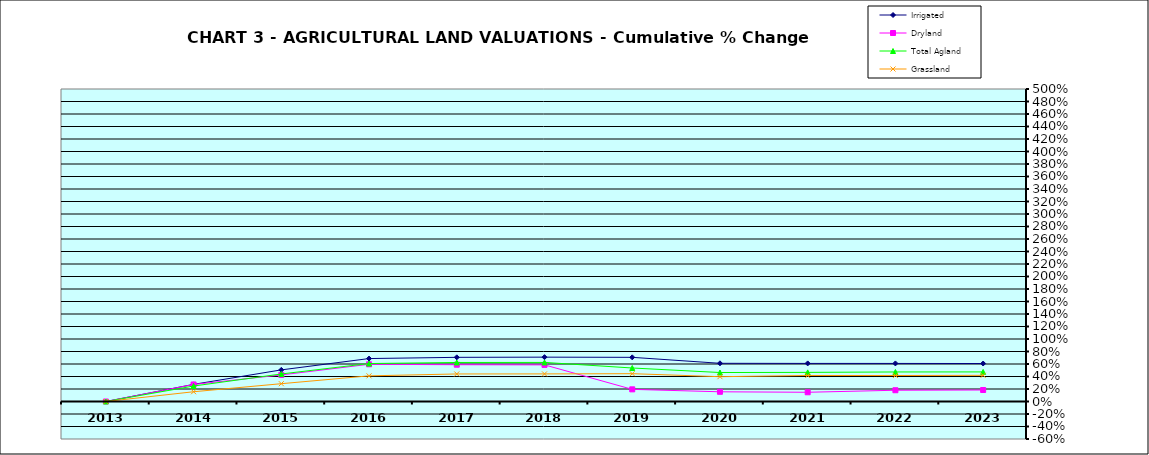
| Category | Irrigated | Dryland | Total Agland | Grassland |
|---|---|---|---|---|
| 2013.0 | 0 | 0 | 0 | 0 |
| 2014.0 | 0.274 | 0.272 | 0.248 | 0.156 |
| 2015.0 | 0.506 | 0.425 | 0.44 | 0.285 |
| 2016.0 | 0.687 | 0.595 | 0.607 | 0.41 |
| 2017.0 | 0.707 | 0.589 | 0.624 | 0.441 |
| 2018.0 | 0.71 | 0.586 | 0.625 | 0.442 |
| 2019.0 | 0.707 | 0.194 | 0.536 | 0.445 |
| 2020.0 | 0.611 | 0.155 | 0.464 | 0.397 |
| 2021.0 | 0.609 | 0.148 | 0.466 | 0.416 |
| 2022.0 | 0.609 | 0.18 | 0.473 | 0.416 |
| 2023.0 | 0.608 | 0.184 | 0.473 | 0.419 |